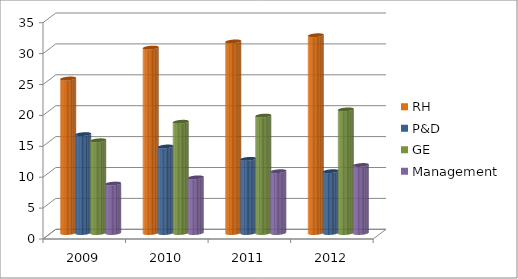
| Category | RH | P&D | GE | Management |
|---|---|---|---|---|
| 2009.0 | 25 | 16 | 15 | 8 |
| 2010.0 | 30 | 14 | 18 | 9 |
| 2011.0 | 31 | 12 | 19 | 10 |
| 2012.0 | 32 | 10 | 20 | 11 |